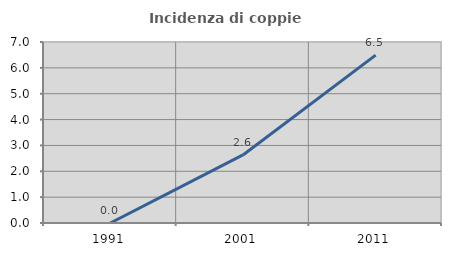
| Category | Incidenza di coppie miste |
|---|---|
| 1991.0 | 0 |
| 2001.0 | 2.632 |
| 2011.0 | 6.494 |